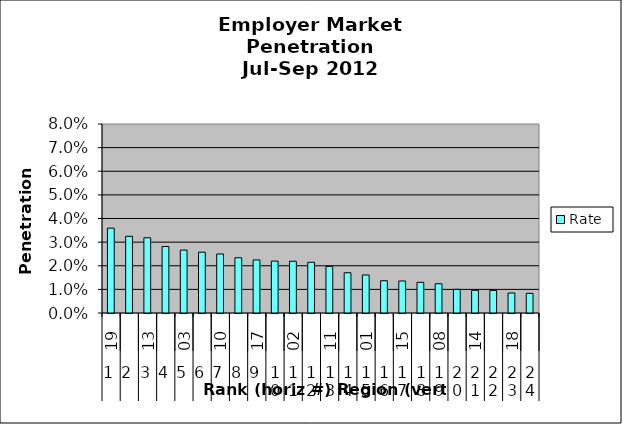
| Category | Rate |
|---|---|
| 0 | 0.036 |
| 1 | 0.032 |
| 2 | 0.032 |
| 3 | 0.028 |
| 4 | 0.027 |
| 5 | 0.026 |
| 6 | 0.025 |
| 7 | 0.023 |
| 8 | 0.022 |
| 9 | 0.022 |
| 10 | 0.022 |
| 11 | 0.021 |
| 12 | 0.02 |
| 13 | 0.017 |
| 14 | 0.016 |
| 15 | 0.014 |
| 16 | 0.014 |
| 17 | 0.013 |
| 18 | 0.012 |
| 19 | 0.01 |
| 20 | 0.01 |
| 21 | 0.01 |
| 22 | 0.008 |
| 23 | 0.008 |